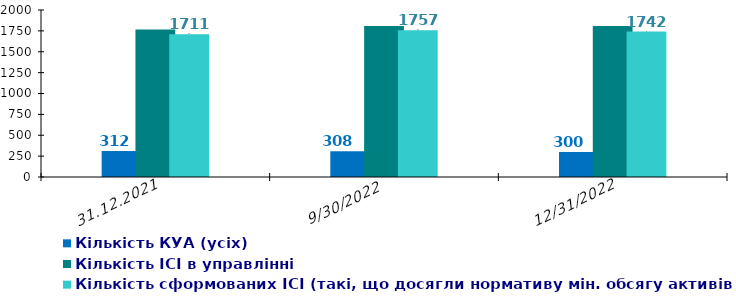
| Category | Кількість КУА (усіх) | Кількість КУА з ІСІ в управлінні | Кількість ІСІ в управлінні  | Кількість сформованих ІСІ (такі, що досягли нормативу мін. обсягу активів)  |
|---|---|---|---|---|
| 31.12.2021 | 312 |  | 1765 | 1711 |
| 30.09.2022 | 308 |  | 1807 | 1757 |
| 31.12.2022 | 300 |  | 1808 | 1742 |